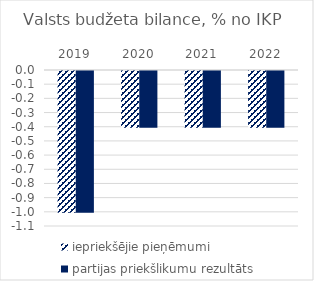
| Category | iepriekšējie pieņēmumi | partijas priekšlikumu rezultāts |
|---|---|---|
| 2019.0 | -1 | -1 |
| 2020.0 | -0.4 | -0.4 |
| 2021.0 | -0.4 | -0.4 |
| 2022.0 | -0.4 | -0.4 |